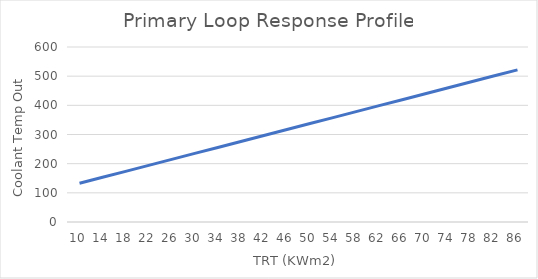
| Category | Series 0 |
|---|---|
| 10.0 | 132.791 |
| 14.0 | 153.261 |
| 18.0 | 173.731 |
| 22.0 | 194.202 |
| 26.0 | 214.672 |
| 30.0 | 235.142 |
| 34.0 | 255.613 |
| 38.0 | 276.083 |
| 42.0 | 296.553 |
| 46.0 | 317.024 |
| 50.0 | 337.494 |
| 54.0 | 357.964 |
| 58.0 | 378.435 |
| 62.0 | 398.905 |
| 66.0 | 419.375 |
| 70.0 | 439.846 |
| 74.0 | 460.316 |
| 78.0 | 480.786 |
| 82.0 | 501.257 |
| 86.0 | 521.727 |